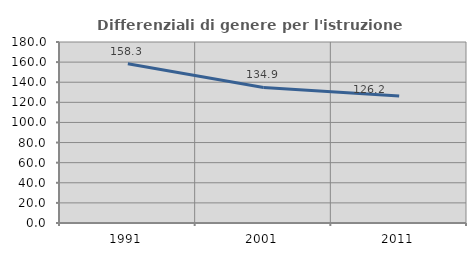
| Category | Differenziali di genere per l'istruzione superiore |
|---|---|
| 1991.0 | 158.299 |
| 2001.0 | 134.851 |
| 2011.0 | 126.19 |